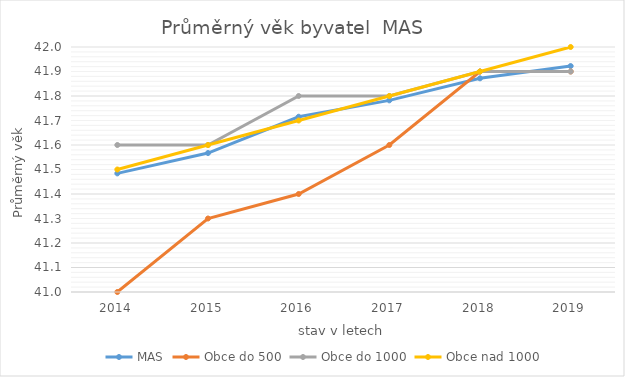
| Category | MAS | Obce do 500 | Obce do 1000 | Obce nad 1000 |
|---|---|---|---|---|
| 2014.0 | 41.484 | 41 | 41.6 | 41.5 |
| 2015.0 | 41.567 | 41.3 | 41.6 | 41.6 |
| 2016.0 | 41.715 | 41.4 | 41.8 | 41.7 |
| 2017.0 | 41.782 | 41.6 | 41.8 | 41.8 |
| 2018.0 | 41.872 | 41.9 | 41.9 | 41.9 |
| 2019.0 | 41.922 | 41.9 | 41.9 | 42 |